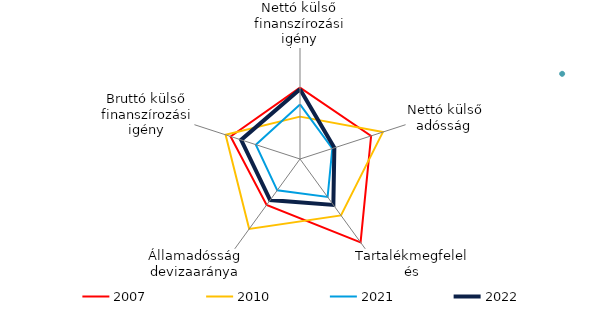
| Category | 2007 | 2008 | 2010 | 2021 | 2022 |
|---|---|---|---|---|---|
| Nettó külső finanszírozási igény | 0.86 | 6.407 | -0.71 | -0.051 | 0.776 |
| Nettó külső adósság  | 1.042 | 11.899 | 1.71 | -1.163 | -1.048 |
| Tartalékmegfelelés | 2.571 | 44.448 | 0.768 | -0.462 | 0.067 |
| Államadósság devizaaránya | 0.071 | 40.066 | 1.672 | -0.908 | -0.253 |
| Bruttó külső finanszírozási igény | 0.945 | 34.692 | 1.23 | -0.489 | 0.346 |